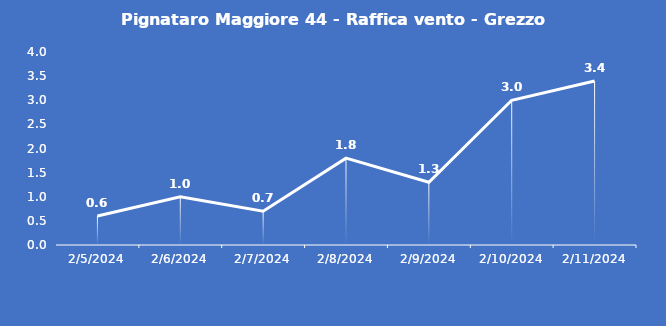
| Category | Pignataro Maggiore 44 - Raffica vento - Grezzo (m/s) |
|---|---|
| 2/5/24 | 0.6 |
| 2/6/24 | 1 |
| 2/7/24 | 0.7 |
| 2/8/24 | 1.8 |
| 2/9/24 | 1.3 |
| 2/10/24 | 3 |
| 2/11/24 | 3.4 |